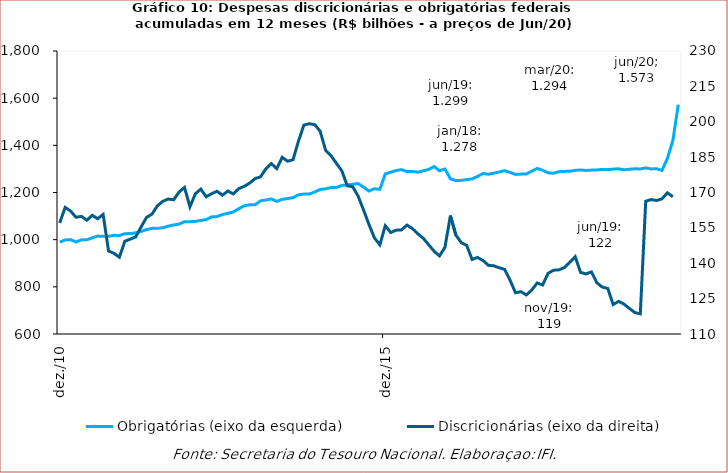
| Category | Obrigatórias (eixo da esquerda) |
|---|---|
| 2010-12-01 | 989347.266 |
| 2011-01-01 | 998762.233 |
| 2011-02-01 | 1000228.09 |
| 2011-03-01 | 990203.198 |
| 2011-04-01 | 999159.586 |
| 2011-05-01 | 999523.819 |
| 2011-06-01 | 1007783.978 |
| 2011-07-01 | 1015243.384 |
| 2011-08-01 | 1014087.063 |
| 2011-09-01 | 1014247.443 |
| 2011-10-01 | 1018429.486 |
| 2011-11-01 | 1017852.532 |
| 2011-12-01 | 1025533.083 |
| 2012-01-01 | 1025710.456 |
| 2012-02-01 | 1029046.664 |
| 2012-03-01 | 1035045.838 |
| 2012-04-01 | 1042787.69 |
| 2012-05-01 | 1047843.108 |
| 2012-06-01 | 1048196.546 |
| 2012-07-01 | 1050707.586 |
| 2012-08-01 | 1057168.505 |
| 2012-09-01 | 1062344.383 |
| 2012-10-01 | 1065916.528 |
| 2012-11-01 | 1076271.266 |
| 2012-12-01 | 1076336.211 |
| 2013-01-01 | 1077526.647 |
| 2013-02-01 | 1081225.95 |
| 2013-03-01 | 1084954.419 |
| 2013-04-01 | 1096649.327 |
| 2013-05-01 | 1097889.56 |
| 2013-06-01 | 1106730.772 |
| 2013-07-01 | 1111680.897 |
| 2013-08-01 | 1117431.738 |
| 2013-09-01 | 1131567.044 |
| 2013-10-01 | 1143248.487 |
| 2013-11-01 | 1147754.616 |
| 2013-12-01 | 1148107.873 |
| 2014-01-01 | 1164529.521 |
| 2014-02-01 | 1168352.504 |
| 2014-03-01 | 1172706.76 |
| 2014-04-01 | 1162642.152 |
| 2014-05-01 | 1170871.56 |
| 2014-06-01 | 1174522.955 |
| 2014-07-01 | 1178003.868 |
| 2014-08-01 | 1190176.657 |
| 2014-09-01 | 1193629.962 |
| 2014-10-01 | 1193771.173 |
| 2014-11-01 | 1201926.883 |
| 2014-12-01 | 1212868.018 |
| 2015-01-01 | 1215527.408 |
| 2015-02-01 | 1220817.239 |
| 2015-03-01 | 1221718.716 |
| 2015-04-01 | 1229707.744 |
| 2015-05-01 | 1232432.575 |
| 2015-06-01 | 1235015.987 |
| 2015-07-01 | 1237969.722 |
| 2015-08-01 | 1222444.741 |
| 2015-09-01 | 1206241.716 |
| 2015-10-01 | 1216047.371 |
| 2015-11-01 | 1213588.693 |
| 2015-12-01 | 1278662.795 |
| 2016-01-01 | 1285902.374 |
| 2016-02-01 | 1293308.112 |
| 2016-03-01 | 1297014.183 |
| 2016-04-01 | 1288571.993 |
| 2016-05-01 | 1289235.655 |
| 2016-06-01 | 1286169.907 |
| 2016-07-01 | 1291958.38 |
| 2016-08-01 | 1297845.246 |
| 2016-09-01 | 1310193.252 |
| 2016-10-01 | 1292132.818 |
| 2016-11-01 | 1299600.825 |
| 2016-12-01 | 1258307.555 |
| 2017-01-01 | 1250526.04 |
| 2017-02-01 | 1251610.743 |
| 2017-03-01 | 1254806.104 |
| 2017-04-01 | 1257436.851 |
| 2017-05-01 | 1268115.969 |
| 2017-06-01 | 1280588.176 |
| 2017-07-01 | 1277407.167 |
| 2017-08-01 | 1282032.204 |
| 2017-09-01 | 1287060.704 |
| 2017-10-01 | 1292733.776 |
| 2017-11-01 | 1285552.891 |
| 2017-12-01 | 1276630.115 |
| 2018-01-01 | 1277997.708 |
| 2018-02-01 | 1278779.138 |
| 2018-03-01 | 1290389.021 |
| 2018-04-01 | 1302097.483 |
| 2018-05-01 | 1294550.079 |
| 2018-06-01 | 1283430.377 |
| 2018-07-01 | 1281881.693 |
| 2018-08-01 | 1288335.931 |
| 2018-09-01 | 1289486.109 |
| 2018-10-01 | 1290041.28 |
| 2018-11-01 | 1293914.386 |
| 2018-12-01 | 1295406.251 |
| 2019-01-01 | 1293381.296 |
| 2019-02-01 | 1294975.158 |
| 2019-03-01 | 1295636.188 |
| 2019-04-01 | 1298064.806 |
| 2019-05-01 | 1297048.364 |
| 2019-06-01 | 1299218.344 |
| 2019-07-01 | 1300434.348 |
| 2019-08-01 | 1296482.724 |
| 2019-09-01 | 1298676.362 |
| 2019-10-01 | 1300382.542 |
| 2019-11-01 | 1299967.895 |
| 2019-12-01 | 1304384.39 |
| 2020-01-01 | 1299954.008 |
| 2020-02-01 | 1300856.023 |
| 2020-03-01 | 1293734.173 |
| 2020-04-01 | 1345192.206 |
| 2020-05-01 | 1420152.783 |
| 2020-06-01 | 1572503.087 |